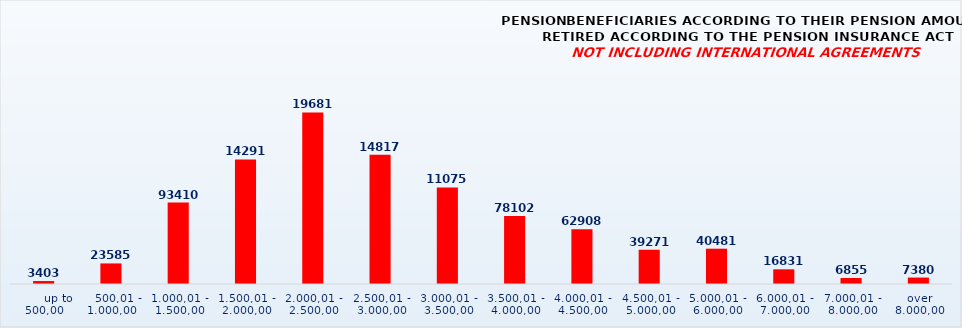
| Category | PENSION BENEFICIARIES ACCORDING TO TYPES AND AMOUNTS OF PENSION, RETIRED ACCORDING TO THE PENSION INSURANCE ACT
NOT INCLUDING INTERNATIONAL AGREEMENTS |
|---|---|
|       up to 500,00 | 3403 |
|    500,01 - 1.000,00 | 23585 |
| 1.000,01 - 1.500,00 | 93410 |
| 1.500,01 - 2.000,00 | 142913 |
| 2.000,01 - 2.500,00 | 196811 |
| 2.500,01 - 3.000,00 | 148178 |
| 3.000,01 - 3.500,00 | 110758 |
| 3.500,01 - 4.000,00 | 78102 |
| 4.000,01 - 4.500,00 | 62908 |
| 4.500,01 - 5.000,00 | 39271 |
| 5.000,01 - 6.000,00 | 40481 |
| 6.000,01 - 7.000,00 | 16831 |
| 7.000,01 - 8.000,00 | 6855 |
|  over  8.000,00 | 7380 |